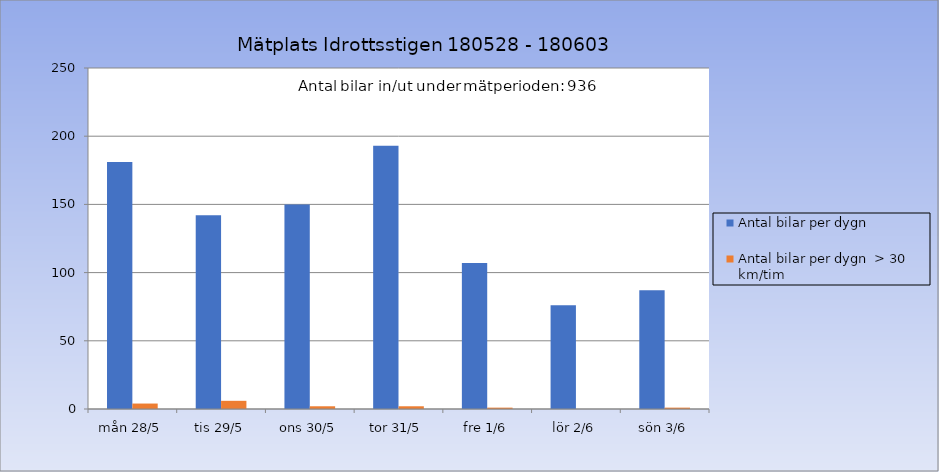
| Category | Antal bilar per dygn | Antal bilar per dygn  > 30 km/tim |
|---|---|---|
| mån 28/5 | 181 | 4 |
| tis 29/5 | 142 | 6 |
| ons 30/5 | 150 | 2 |
| tor 31/5 | 193 | 2 |
| fre 1/6 | 107 | 1 |
| lör 2/6 | 76 | 0 |
| sön 3/6 | 87 | 1 |